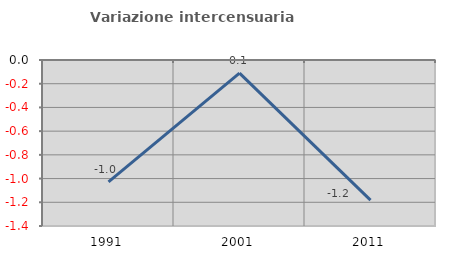
| Category | Variazione intercensuaria annua |
|---|---|
| 1991.0 | -1.028 |
| 2001.0 | -0.111 |
| 2011.0 | -1.182 |